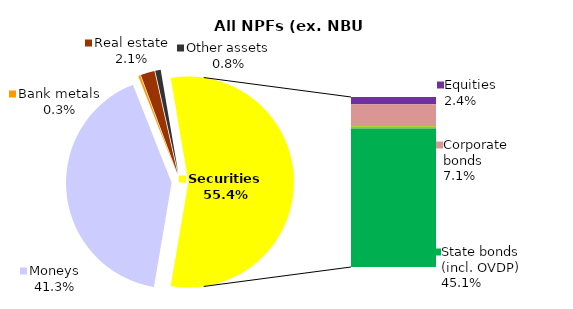
| Category | All NPF (ex.  NBU CNPF) |
|---|---|
| Moneys | 662.762 |
| Bank metals | 4.975 |
| Real estate | 34.35 |
| Other assets | 13.421 |
| Equities | 38.237 |
| Corporate bonds | 114.276 |
| Municipal bonds | 11.573 |
| State bonds (incl. OVDP) | 723.559 |